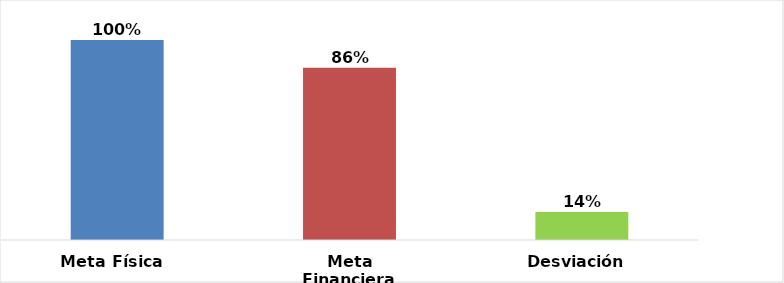
| Category | Meta Física  |
|---|---|
| Meta Física  | 1 |
| Meta Financiera | 0.862 |
| Desviación  | 0.14 |